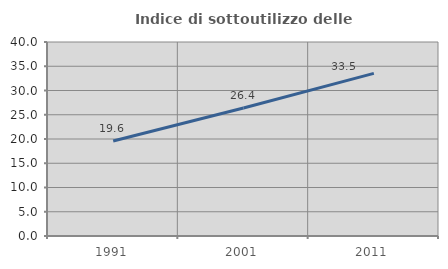
| Category | Indice di sottoutilizzo delle abitazioni  |
|---|---|
| 1991.0 | 19.603 |
| 2001.0 | 26.405 |
| 2011.0 | 33.531 |